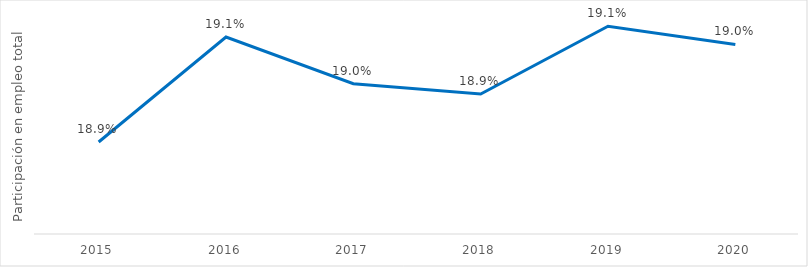
| Category | Series 0 |
|---|---|
| 2015.0 | 0.189 |
| 2016.0 | 0.191 |
| 2017.0 | 0.19 |
| 2018.0 | 0.189 |
| 2019.0 | 0.191 |
| 2020.0 | 0.19 |